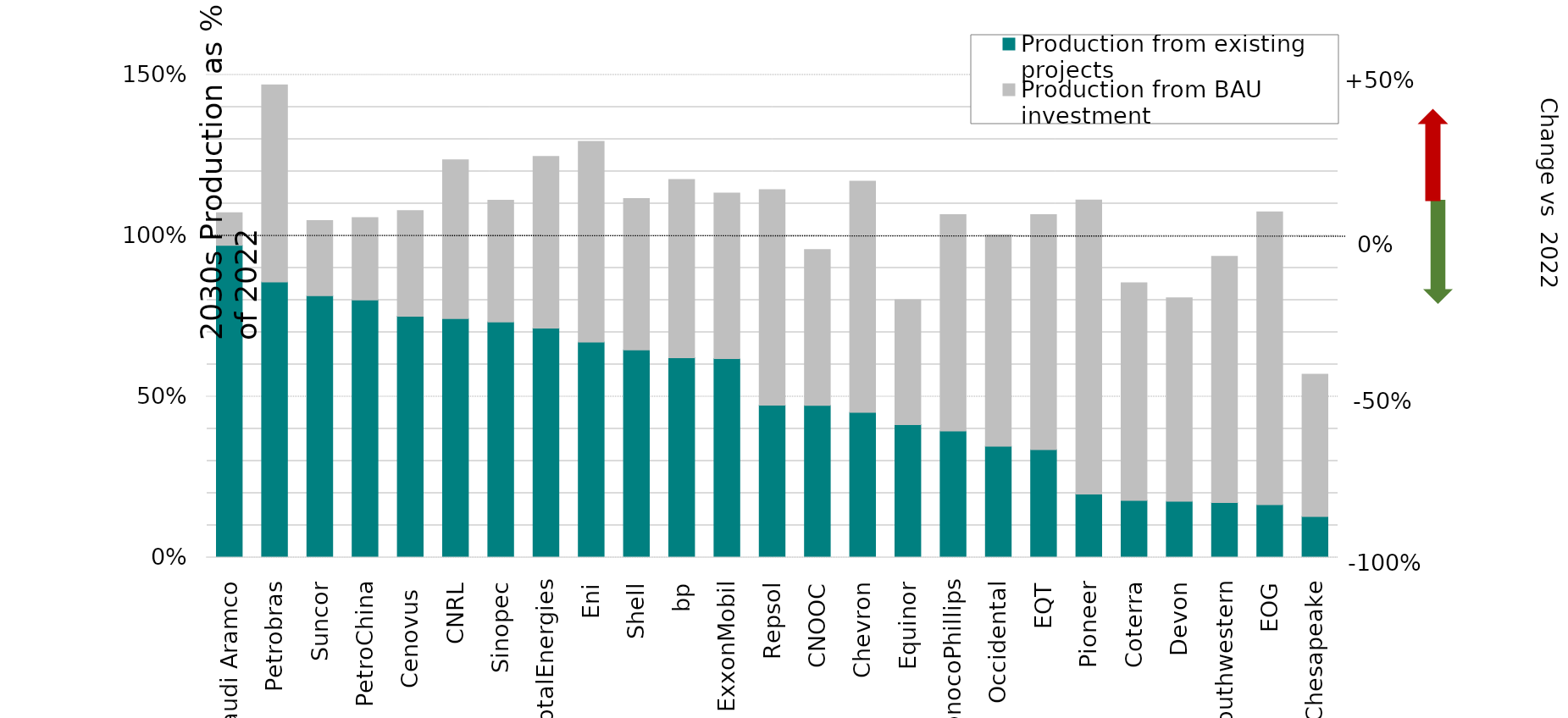
| Category | Production from existing projects | Production from BAU investment |
|---|---|---|
| Saudi Aramco | 0.97 | 0.102 |
| Petrobras | 0.857 | 0.612 |
| Suncor | 0.814 | 0.234 |
| PetroChina | 0.8 | 0.256 |
| Cenovus  | 0.75 | 0.328 |
| CNRL | 0.743 | 0.493 |
| Sinopec | 0.733 | 0.378 |
| TotalEnergies | 0.713 | 0.534 |
| Eni | 0.67 | 0.624 |
| Shell | 0.645 | 0.471 |
| bp | 0.621 | 0.554 |
| ExxonMobil | 0.619 | 0.515 |
| Repsol | 0.474 | 0.67 |
| CNOOC | 0.473 | 0.484 |
| Chevron | 0.451 | 0.718 |
| Equinor | 0.413 | 0.388 |
| ConocoPhillips | 0.393 | 0.673 |
| Occidental | 0.346 | 0.657 |
| EQT | 0.336 | 0.73 |
| Pioneer | 0.197 | 0.914 |
| Coterra | 0.178 | 0.677 |
| Devon | 0.175 | 0.632 |
| Southwestern | 0.171 | 0.765 |
| EOG | 0.164 | 0.91 |
| Chesapeake | 0.127 | 0.442 |